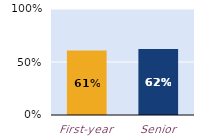
| Category | substantially |
|---|---|
| First-year | 0.608 |
| Senior | 0.623 |